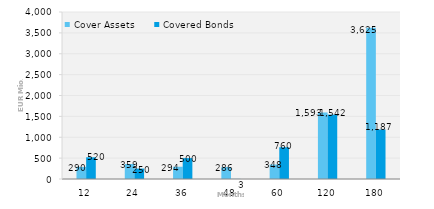
| Category | Cover Assets | Covered Bonds |
|---|---|---|
| 12.0 | 290.285 | 520 |
| 24.0 | 359.426 | 250 |
| 36.0 | 293.657 | 500 |
| 48.0 | 286.126 | 3 |
| 60.0 | 347.688 | 760.081 |
| 120.0 | 1593.132 | 1542.112 |
| 180.0 | 3624.87 | 1187 |